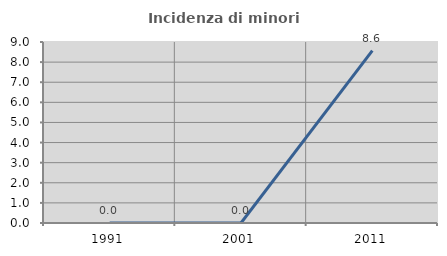
| Category | Incidenza di minori stranieri |
|---|---|
| 1991.0 | 0 |
| 2001.0 | 0 |
| 2011.0 | 8.571 |